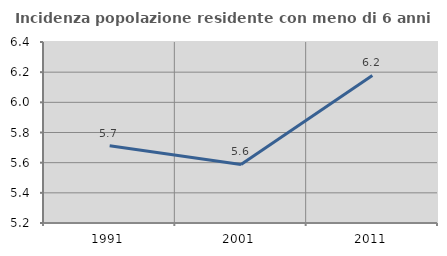
| Category | Incidenza popolazione residente con meno di 6 anni |
|---|---|
| 1991.0 | 5.712 |
| 2001.0 | 5.588 |
| 2011.0 | 6.178 |